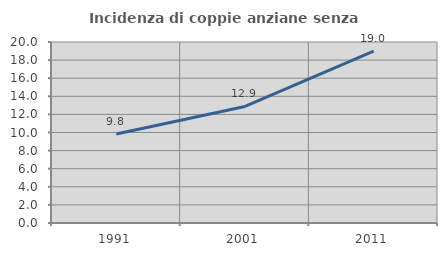
| Category | Incidenza di coppie anziane senza figli  |
|---|---|
| 1991.0 | 9.843 |
| 2001.0 | 12.879 |
| 2011.0 | 18.983 |